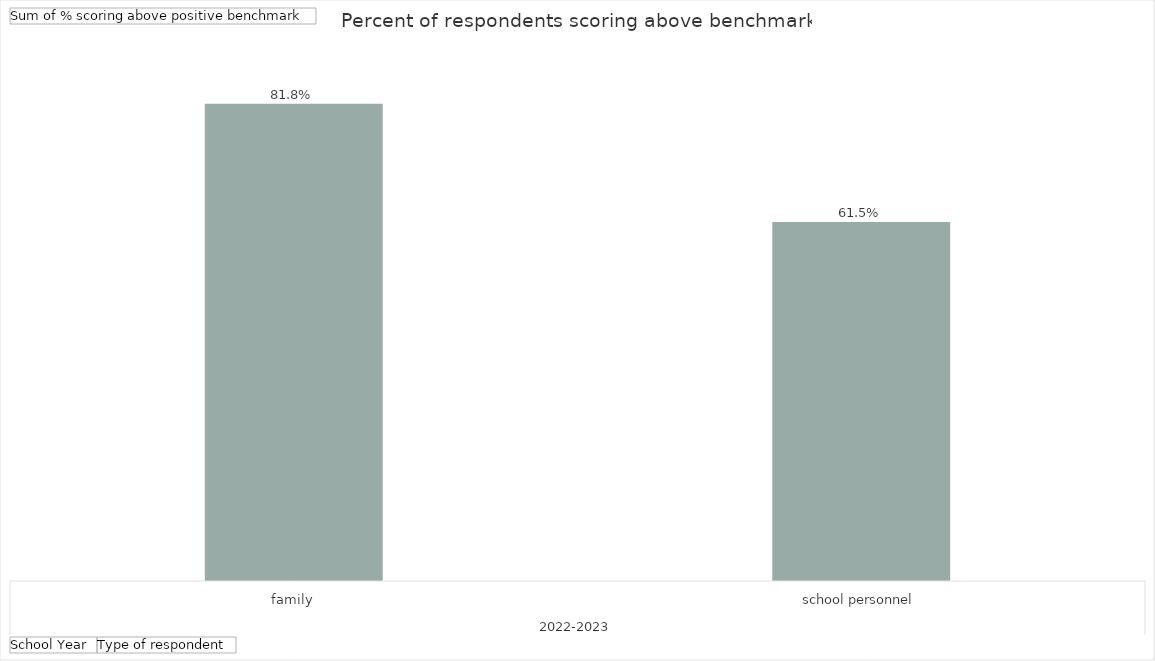
| Category | Total |
|---|---|
| 0 | 0.818 |
| 1 | 0.615 |